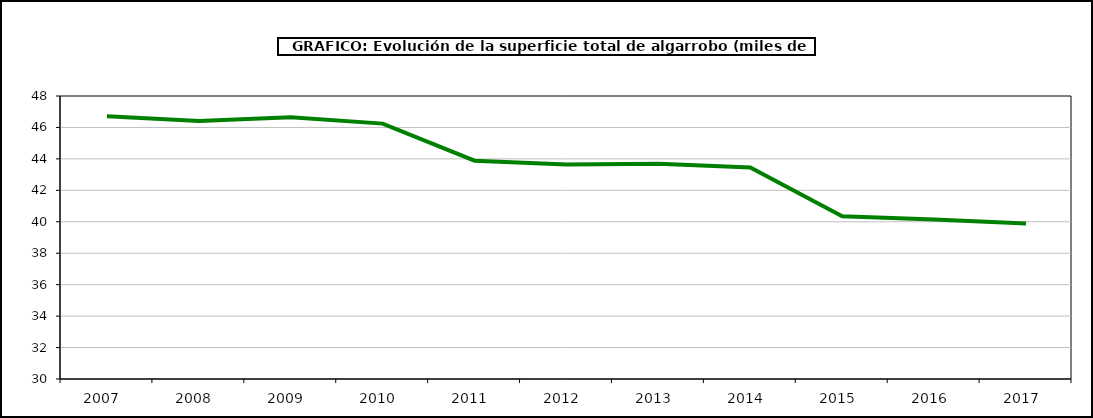
| Category | superficie |
|---|---|
| 2007.0 | 46.708 |
| 2008.0 | 46.404 |
| 2009.0 | 46.656 |
| 2010.0 | 46.243 |
| 2011.0 | 43.883 |
| 2012.0 | 43.647 |
| 2013.0 | 43.695 |
| 2014.0 | 43.447 |
| 2015.0 | 40.353 |
| 2016.0 | 40.144 |
| 2017.0 | 39.889 |